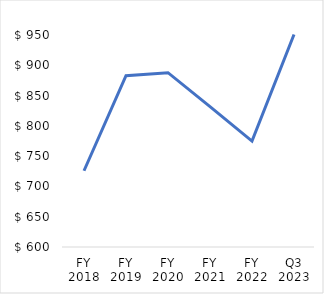
| Category | Series 0 |
|---|---|
| FY 2018 | 726 |
| FY 2019 | 883 |
| FY 2020 | 888 |
| FY 2021 | 832 |
| FY 2022 | 775 |
| Q3 2023 | 951 |